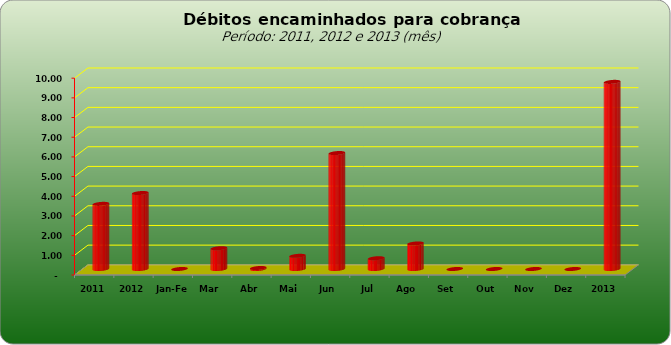
| Category |  3.309.443,02   3.859.728,44   -     1.053.903,71   50.529,60   669.296,13   5.890.806,29   546.448,11   1.296.316,32   -     -     -     -     9.507.300,16  |
|---|---|
| 2011 | 3309443.02 |
| 2012 | 3859728.44 |
| Jan-Fev | 0 |
| Mar | 1053903.71 |
| Abr | 50529.6 |
| Mai | 669296.13 |
| Jun | 5890806.29 |
| Jul | 546448.11 |
| Ago | 1296316.32 |
| Set | 0 |
| Out | 0 |
| Nov | 0 |
| Dez | 0 |
| 2013 | 9507300.16 |